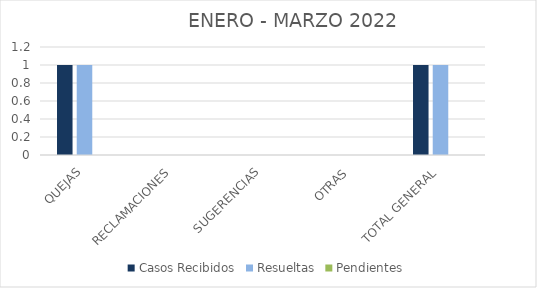
| Category | Casos Recibidos | Resueltas | Pendientes |
|---|---|---|---|
| QUEJAS | 1 | 1 | 0 |
| RECLAMACIONES | 0 | 0 | 0 |
| SUGERENCIAS | 0 | 0 | 0 |
| OTRAS | 0 | 0 | 0 |
| TOTAL GENERAL | 1 | 1 | 0 |